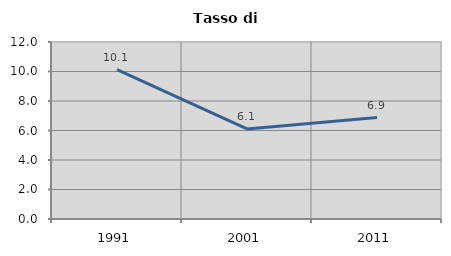
| Category | Tasso di disoccupazione   |
|---|---|
| 1991.0 | 10.121 |
| 2001.0 | 6.105 |
| 2011.0 | 6.877 |